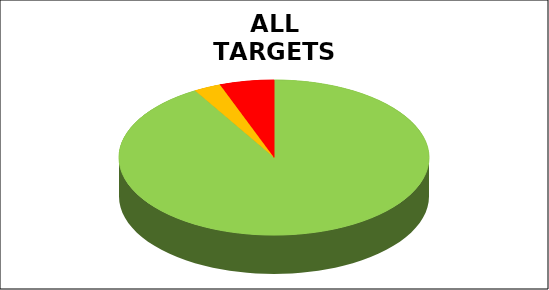
| Category | Series 0 |
|---|---|
| Green | 0.915 |
| Amber | 0.028 |
| Red | 0.057 |